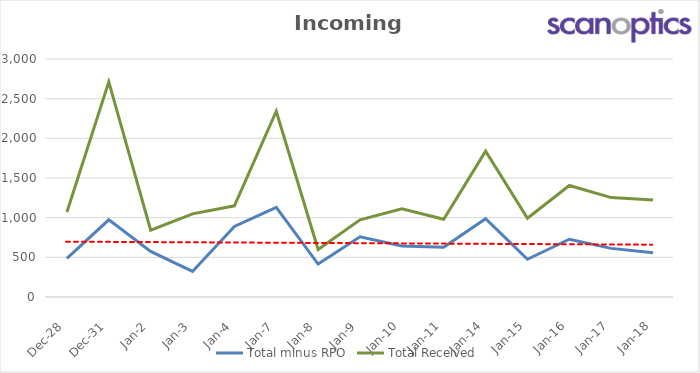
| Category | Total minus RPO | Total Received |
|---|---|---|
| 2018-12-28 | 486 | 1072 |
| 2018-12-31 | 973 | 2712 |
| 2019-01-02 | 574 | 842 |
| 2019-01-03 | 322 | 1048 |
| 2019-01-04 | 890 | 1149 |
| 2019-01-07 | 1131 | 2342 |
| 2019-01-08 | 415 | 598 |
| 2019-01-09 | 758 | 972 |
| 2019-01-10 | 644 | 1112 |
| 2019-01-11 | 626 | 980 |
| 2019-01-14 | 987 | 1839 |
| 2019-01-15 | 475 | 993 |
| 2019-01-16 | 728 | 1406 |
| 2019-01-17 | 613 | 1253 |
| 2019-01-18 | 558 | 1222 |